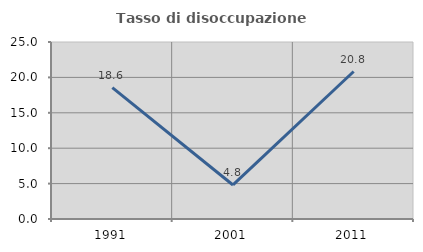
| Category | Tasso di disoccupazione giovanile  |
|---|---|
| 1991.0 | 18.557 |
| 2001.0 | 4.808 |
| 2011.0 | 20.833 |